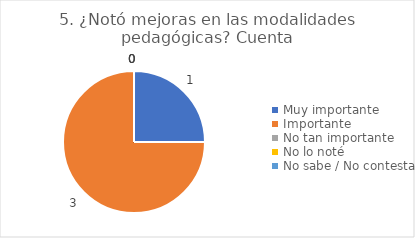
| Category | 5. ¿Notó mejoras en las modalidades pedagógicas? |
|---|---|
| Muy importante  | 0.25 |
| Importante  | 0.75 |
| No tan importante  | 0 |
| No lo noté  | 0 |
| No sabe / No contesta | 0 |